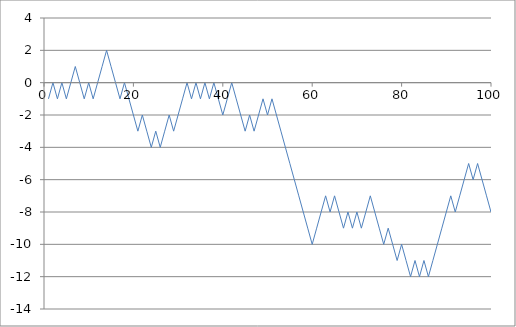
| Category | Series 0 |
|---|---|
| 0 | -1 |
| 1 | 0 |
| 2 | -1 |
| 3 | 0 |
| 4 | -1 |
| 5 | 0 |
| 6 | 1 |
| 7 | 0 |
| 8 | -1 |
| 9 | 0 |
| 10 | -1 |
| 11 | 0 |
| 12 | 1 |
| 13 | 2 |
| 14 | 1 |
| 15 | 0 |
| 16 | -1 |
| 17 | 0 |
| 18 | -1 |
| 19 | -2 |
| 20 | -3 |
| 21 | -2 |
| 22 | -3 |
| 23 | -4 |
| 24 | -3 |
| 25 | -4 |
| 26 | -3 |
| 27 | -2 |
| 28 | -3 |
| 29 | -2 |
| 30 | -1 |
| 31 | 0 |
| 32 | -1 |
| 33 | 0 |
| 34 | -1 |
| 35 | 0 |
| 36 | -1 |
| 37 | 0 |
| 38 | -1 |
| 39 | -2 |
| 40 | -1 |
| 41 | 0 |
| 42 | -1 |
| 43 | -2 |
| 44 | -3 |
| 45 | -2 |
| 46 | -3 |
| 47 | -2 |
| 48 | -1 |
| 49 | -2 |
| 50 | -1 |
| 51 | -2 |
| 52 | -3 |
| 53 | -4 |
| 54 | -5 |
| 55 | -6 |
| 56 | -7 |
| 57 | -8 |
| 58 | -9 |
| 59 | -10 |
| 60 | -9 |
| 61 | -8 |
| 62 | -7 |
| 63 | -8 |
| 64 | -7 |
| 65 | -8 |
| 66 | -9 |
| 67 | -8 |
| 68 | -9 |
| 69 | -8 |
| 70 | -9 |
| 71 | -8 |
| 72 | -7 |
| 73 | -8 |
| 74 | -9 |
| 75 | -10 |
| 76 | -9 |
| 77 | -10 |
| 78 | -11 |
| 79 | -10 |
| 80 | -11 |
| 81 | -12 |
| 82 | -11 |
| 83 | -12 |
| 84 | -11 |
| 85 | -12 |
| 86 | -11 |
| 87 | -10 |
| 88 | -9 |
| 89 | -8 |
| 90 | -7 |
| 91 | -8 |
| 92 | -7 |
| 93 | -6 |
| 94 | -5 |
| 95 | -6 |
| 96 | -5 |
| 97 | -6 |
| 98 | -7 |
| 99 | -8 |